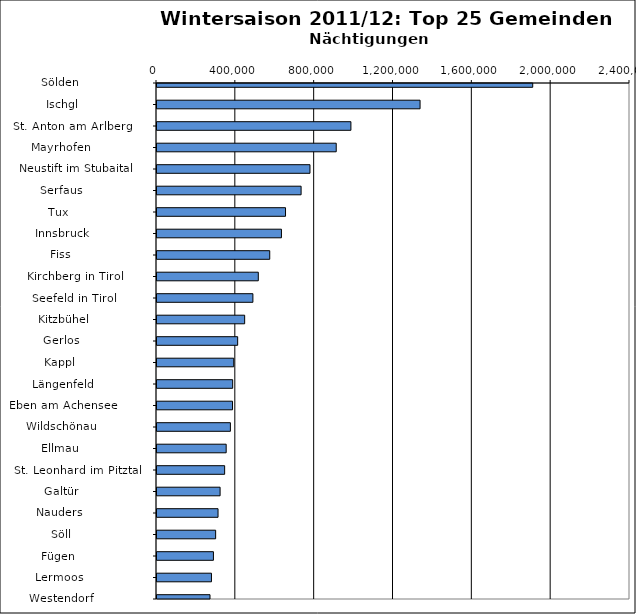
| Category | Series 0 |
|---|---|
|   Sölden                     | 1906463 |
|   Ischgl                     | 1334806 |
|   St. Anton am Arlberg       | 983918 |
|   Mayrhofen                  | 909401 |
|   Neustift im Stubaital      | 776219 |
|   Serfaus                    | 731151 |
|   Tux                        | 652094 |
|   Innsbruck                  | 631423 |
|   Fiss                       | 572044 |
|   Kirchberg in Tirol         | 514008 |
|   Seefeld in Tirol           | 486611 |
|   Kitzbühel                  | 444799 |
|   Gerlos                     | 409311 |
|   Kappl                      | 389393 |
|   Längenfeld                 | 384007 |
|   Eben am Achensee           | 383231 |
|   Wildschönau                | 372450 |
|   Ellmau                     | 351032 |
|   St. Leonhard im Pitztal    | 343227 |
|   Galtür                     | 320193 |
|   Nauders                    | 309684 |
|   Söll                       | 297564 |
|   Fügen                      | 286299 |
|   Lermoos                    | 276322 |
|   Westendorf                 | 268925 |